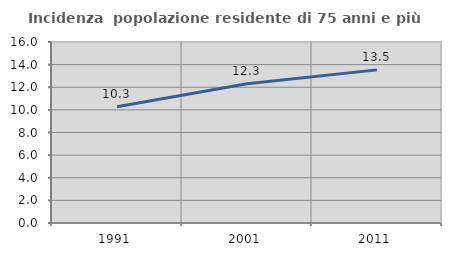
| Category | Incidenza  popolazione residente di 75 anni e più |
|---|---|
| 1991.0 | 10.278 |
| 2001.0 | 12.308 |
| 2011.0 | 13.537 |